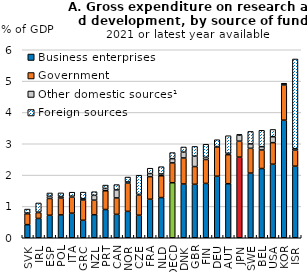
| Category | Business enterprises | Government | Other domestic sources¹ | Foreign sources |
|---|---|---|---|---|
| SVK | 0.418 | 0.347 | 0.023 | 0.127 |
| IRL | 0.617 | 0.186 | 0.016 | 0.292 |
| ESP | 0.718 | 0.535 | 0.069 | 0.107 |
| POL | 0.73 | 0.535 | 0.05 | 0.117 |
| ITA | 0.784 | 0.511 | 0.031 | 0.128 |
| GRC | 0.558 | 0.647 | 0.042 | 0.21 |
| NZL | 0.736 | 0.464 | 0.153 | 0.117 |
| PRT | 0.902 | 0.598 | 0.075 | 0.106 |
| CAN | 0.747 | 0.524 | 0.255 | 0.171 |
| NOR | 0.842 | 0.902 | 0.037 | 0.156 |
| CZE | 0.72 | 0.645 | 0.022 | 0.61 |
| FRA | 1.23 | 0.72 | 0.098 | 0.171 |
| NLD | 1.282 | 0.696 | 0.056 | 0.234 |
| OECD | 1.756 | 0.633 | 0.136 | 0.193 |
| DNK | 1.716 | 0.83 | 0.187 | 0.163 |
| GBR | 1.706 | 0.566 | 0.333 | 0.31 |
| FIN | 1.734 | 0.764 | 0.069 | 0.418 |
| DEU | 1.964 | 0.938 | 0.01 | 0.217 |
| AUT | 1.725 | 0.927 | 0.044 | 0.561 |
| JPN | 2.573 | 0.509 | 0.193 | 0.02 |
| SWE | 2.064 | 0.791 | 0.141 | 0.398 |
| BEL | 2.209 | 0.592 | 0.106 | 0.523 |
| USA | 2.348 | 0.687 | 0.189 | 0.233 |
| KOR | 3.753 | 1.124 | 0.039 | 0.014 |
| ISR | 2.284 | 0.51 | 0.048 | 2.863 |